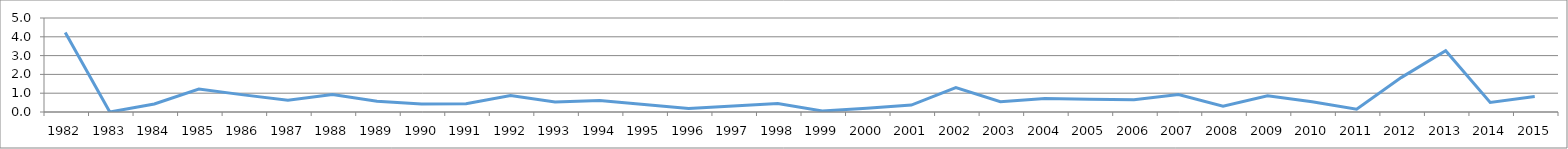
| Category | Series 0 |
|---|---|
| 2015 | 0.827 |
| 2014 | 0.504 |
| 2013 | 3.256 |
| 2012 | 1.83 |
| 2011 | 0.151 |
| 2010 | 0.543 |
| 2009 | 0.867 |
| 2008 | 0.314 |
| 2007 | 0.924 |
| 2006 | 0.651 |
| 2005 | 0.682 |
| 2004 | 0.72 |
| 2003 | 0.549 |
| 2002 | 1.298 |
| 2001 | 0.367 |
| 2000 | 0.204 |
| 1999 | 0.055 |
| 1998 | 0.455 |
| 1997 | 0.324 |
| 1996 | 0.189 |
| 1995 | 0.398 |
| 1994 | 0.613 |
| 1993 | 0.538 |
| 1992 | 0.877 |
| 1991 | 0.435 |
| 1990 | 0.426 |
| 1989 | 0.578 |
| 1988 | 0.928 |
| 1987 | 0.626 |
| 1986 | 0.911 |
| 1985 | 1.225 |
| 1984 | 0.424 |
| 1983 | 0 |
| 1982 | 4.225 |